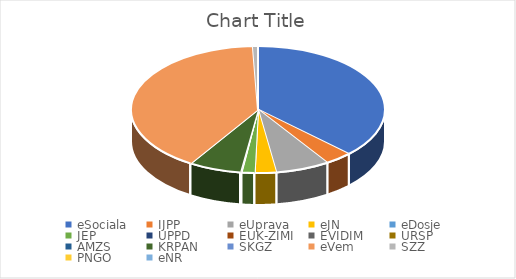
| Category | Series 0 |
|---|---|
| eSociala | 7566602 |
| IJPP | 706678 |
| eUprava | 1393645 |
| eJN | 552145 |
| eDosje | 0 |
| JEP | 332347 |
| UPPD | 13238 |
| EUK-ZIMI | 1376 |
| EVIDIM | 0 |
| URSP | 21402 |
| AMZS | 4049 |
| KRPAN | 1346872 |
| SKGZ | 1270 |
| eVem | 8196683 |
| SZZ | 130179 |
| PNGO | 4 |
| eNR | 169 |